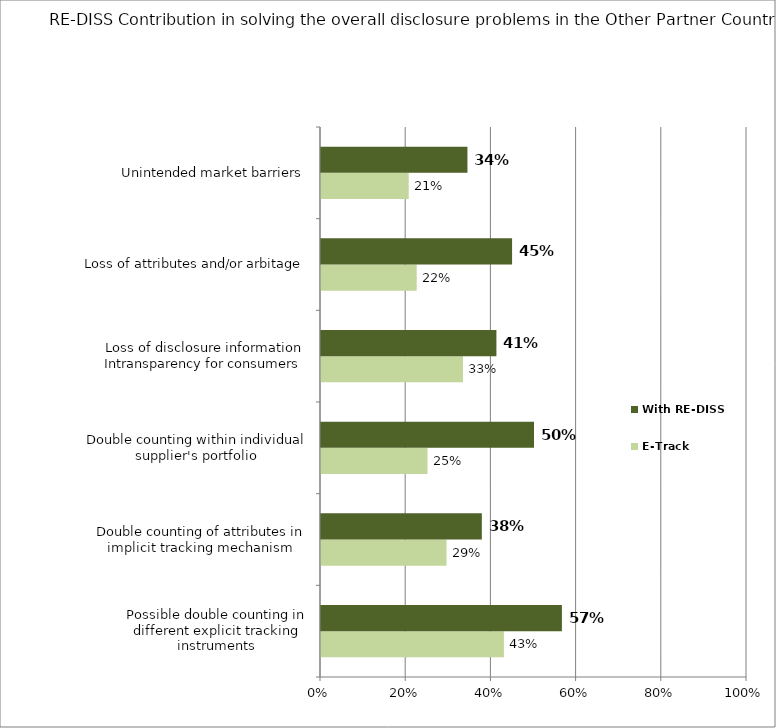
| Category | E-Track | With RE-DISS |
|---|---|---|
| Possible double counting in different explicit tracking instruments | 0.429 | 0.565 |
| Double counting of attributes in implicit tracking mechanism | 0.295 | 0.378 |
| Double counting within individual supplier's portfolio | 0.25 | 0.5 |
| Loss of disclosure information
Intransparency for consumers | 0.333 | 0.412 |
| Loss of attributes and/or arbitage | 0.225 | 0.449 |
| Unintended market barriers | 0.206 | 0.344 |